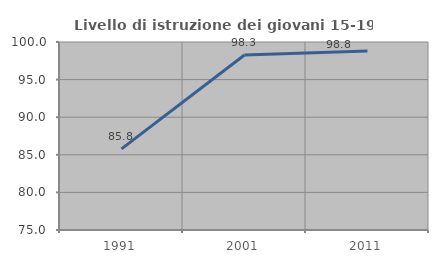
| Category | Livello di istruzione dei giovani 15-19 anni |
|---|---|
| 1991.0 | 85.787 |
| 2001.0 | 98.276 |
| 2011.0 | 98.802 |